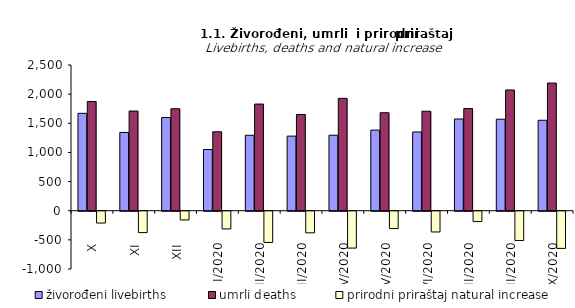
| Category | živorođeni livebirths | umrli deaths | prirodni priraštaj natural increase |
|---|---|---|---|
| X | 1671 | 1874 | -203 |
| XI | 1343 | 1710 | -367 |
| XII | 1599 | 1749 | -150 |
| I/2020 | 1050 | 1354 | -304 |
| II/2020 | 1294 | 1830 | -536 |
| III/2020 | 1280 | 1651 | -371 |
| IV/2020 | 1295 | 1928 | -633 |
| V/2020 | 1383 | 1681 | -298 |
| VI/2020 | 1351 | 1707 | -356 |
| VII/2020 | 1574 | 1752 | -178 |
| VIII/2020 | 1570 | 2072 | -502 |
| IX/2020 | 1552 | 2190 | -638 |